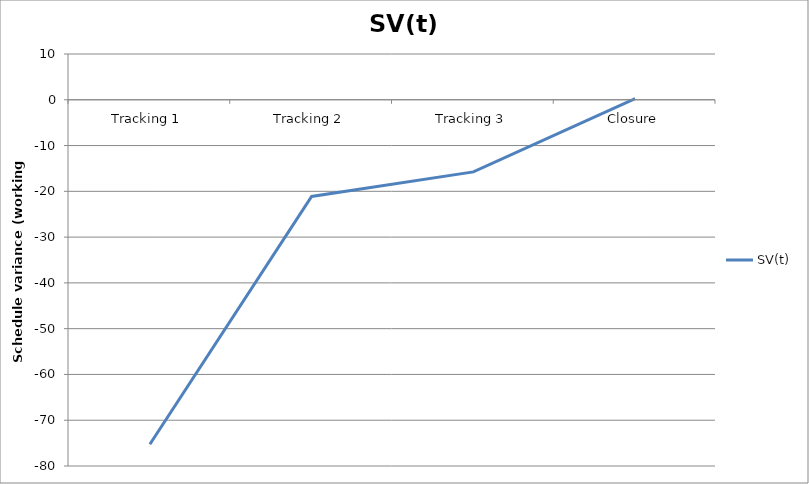
| Category | SV(t) |
|---|---|
| Tracking 1 | -75.25 |
| Tracking 2 | -21.125 |
| Tracking 3 | -15.75 |
| Closure | 0.25 |